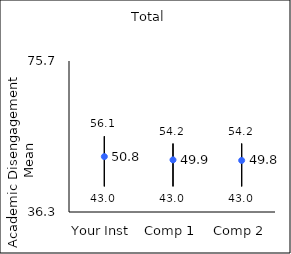
| Category | 25th percentile | 75th percentile | Mean |
|---|---|---|---|
| Your Inst | 43 | 56.1 | 50.79 |
| Comp 1 | 43 | 54.2 | 49.94 |
| Comp 2 | 43 | 54.2 | 49.79 |